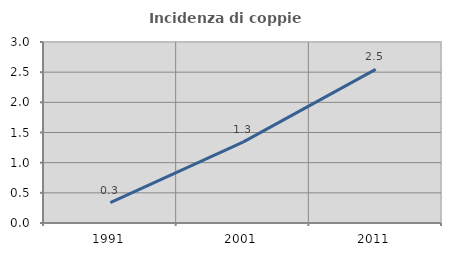
| Category | Incidenza di coppie miste |
|---|---|
| 1991.0 | 0.339 |
| 2001.0 | 1.341 |
| 2011.0 | 2.546 |